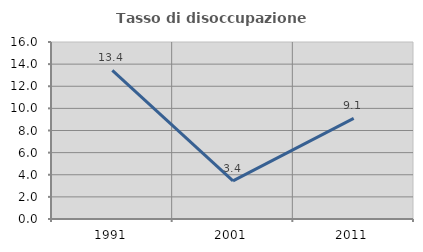
| Category | Tasso di disoccupazione giovanile  |
|---|---|
| 1991.0 | 13.441 |
| 2001.0 | 3.448 |
| 2011.0 | 9.091 |